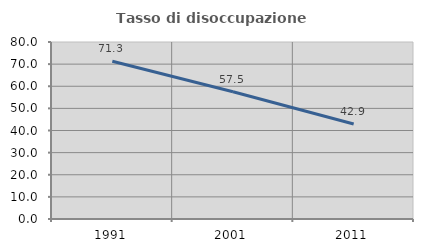
| Category | Tasso di disoccupazione giovanile  |
|---|---|
| 1991.0 | 71.303 |
| 2001.0 | 57.515 |
| 2011.0 | 42.926 |